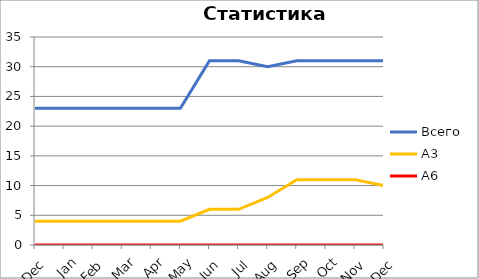
| Category | Всего | А3 | A6 |
|---|---|---|---|
| 0 | 23 | 4 | 0 |
| 1 | 23 | 4 | 0 |
| 2 | 23 | 4 | 0 |
| 3 | 23 | 4 | 0 |
| 4 | 23 | 4 | 0 |
| 5 | 23 | 4 | 0 |
| 6 | 31 | 6 | 0 |
| 7 | 31 | 6 | 0 |
| 8 | 30 | 8 | 0 |
| 9 | 31 | 11 | 0 |
| 10 | 31 | 11 | 0 |
| 11 | 31 | 11 | 0 |
| 12 | 31 | 10 | 0 |